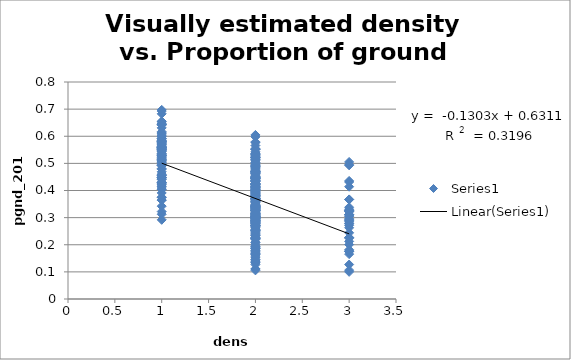
| Category | Series 0 |
|---|---|
| 2.0 | 0.276 |
| 2.0 | 0.466 |
| 1.0 | 0.522 |
| 1.0 | 0.528 |
| 2.0 | 0.464 |
| 2.0 | 0.472 |
| 2.0 | 0.423 |
| 2.0 | 0.474 |
| 2.0 | 0.461 |
| 1.0 | 0.43 |
| 1.0 | 0.542 |
| 2.0 | 0.434 |
| 1.0 | 0.492 |
| 1.0 | 0.446 |
| 1.0 | 0.59 |
| 1.0 | 0.46 |
| 1.0 | 0.555 |
| 1.0 | 0.585 |
| 2.0 | 0.466 |
| 1.0 | 0.457 |
| 2.0 | 0.401 |
| 2.0 | 0.42 |
| 2.0 | 0.426 |
| 2.0 | 0.323 |
| 2.0 | 0.555 |
| 1.0 | 0.517 |
| 1.0 | 0.559 |
| 1.0 | 0.592 |
| 2.0 | 0.399 |
| 2.0 | 0.421 |
| 1.0 | 0.481 |
| 2.0 | 0.426 |
| 1.0 | 0.644 |
| 2.0 | 0.371 |
| 2.0 | 0.407 |
| 1.0 | 0.693 |
| 1.0 | 0.697 |
| 1.0 | 0.574 |
| 2.0 | 0.491 |
| 2.0 | 0.434 |
| 2.0 | 0.299 |
| 2.0 | 0.521 |
| 2.0 | 0.411 |
| 3.0 | 0.505 |
| 1.0 | 0.469 |
| 1.0 | 0.405 |
| 1.0 | 0.548 |
| 1.0 | 0.605 |
| 2.0 | 0.46 |
| 1.0 | 0.43 |
| 1.0 | 0.567 |
| 1.0 | 0.55 |
| 2.0 | 0.444 |
| 2.0 | 0.443 |
| 2.0 | 0.535 |
| 2.0 | 0.492 |
| 2.0 | 0.503 |
| 2.0 | 0.498 |
| 2.0 | 0.438 |
| 1.0 | 0.655 |
| 3.0 | 0.338 |
| 2.0 | 0.434 |
| 2.0 | 0.525 |
| 2.0 | 0.51 |
| 1.0 | 0.553 |
| 2.0 | 0.514 |
| 2.0 | 0.451 |
| 2.0 | 0.409 |
| 2.0 | 0.409 |
| 2.0 | 0.421 |
| 1.0 | 0.455 |
| 2.0 | 0.422 |
| 1.0 | 0.501 |
| 1.0 | 0.376 |
| 1.0 | 0.454 |
| 2.0 | 0.416 |
| 2.0 | 0.395 |
| 2.0 | 0.443 |
| 2.0 | 0.39 |
| 1.0 | 0.524 |
| 2.0 | 0.367 |
| 2.0 | 0.381 |
| 2.0 | 0.448 |
| 2.0 | 0.417 |
| 1.0 | 0.558 |
| 1.0 | 0.653 |
| 2.0 | 0.482 |
| 1.0 | 0.492 |
| 2.0 | 0.515 |
| 2.0 | 0.422 |
| 2.0 | 0.45 |
| 2.0 | 0.536 |
| 2.0 | 0.579 |
| 1.0 | 0.571 |
| 2.0 | 0.47 |
| 3.0 | 0.495 |
| 2.0 | 0.454 |
| 2.0 | 0.427 |
| 2.0 | 0.495 |
| 2.0 | 0.414 |
| 2.0 | 0.34 |
| 2.0 | 0.521 |
| 2.0 | 0.552 |
| 2.0 | 0.52 |
| 2.0 | 0.49 |
| 1.0 | 0.645 |
| 2.0 | 0.409 |
| 2.0 | 0.449 |
| 1.0 | 0.562 |
| 2.0 | 0.487 |
| 1.0 | 0.515 |
| 1.0 | 0.581 |
| 1.0 | 0.559 |
| 3.0 | 0.493 |
| 3.0 | 0.277 |
| 2.0 | 0.42 |
| 2.0 | 0.437 |
| 2.0 | 0.529 |
| 2.0 | 0.534 |
| 2.0 | 0.577 |
| 2.0 | 0.598 |
| 2.0 | 0.483 |
| 2.0 | 0.366 |
| 2.0 | 0.427 |
| 2.0 | 0.513 |
| 2.0 | 0.534 |
| 1.0 | 0.617 |
| 1.0 | 0.559 |
| 2.0 | 0.531 |
| 1.0 | 0.551 |
| 2.0 | 0.463 |
| 3.0 | 0.414 |
| 2.0 | 0.489 |
| 2.0 | 0.384 |
| 3.0 | 0.367 |
| 3.0 | 0.367 |
| 2.0 | 0.338 |
| 1.0 | 0.415 |
| 2.0 | 0.535 |
| 2.0 | 0.504 |
| 2.0 | 0.432 |
| 2.0 | 0.452 |
| 2.0 | 0.519 |
| 2.0 | 0.47 |
| 2.0 | 0.35 |
| 1.0 | 0.425 |
| 1.0 | 0.585 |
| 1.0 | 0.508 |
| 2.0 | 0.406 |
| 2.0 | 0.371 |
| 2.0 | 0.411 |
| 2.0 | 0.363 |
| 2.0 | 0.469 |
| 2.0 | 0.388 |
| 2.0 | 0.52 |
| 2.0 | 0.444 |
| 2.0 | 0.413 |
| 2.0 | 0.442 |
| 3.0 | 0.435 |
| 2.0 | 0.535 |
| 3.0 | 0.327 |
| 1.0 | 0.598 |
| 2.0 | 0.379 |
| 3.0 | 0.244 |
| 1.0 | 0.645 |
| 3.0 | 0.326 |
| 1.0 | 0.569 |
| 1.0 | 0.545 |
| 2.0 | 0.538 |
| 3.0 | 0.325 |
| 1.0 | 0.613 |
| 1.0 | 0.53 |
| 1.0 | 0.51 |
| 1.0 | 0.571 |
| 2.0 | 0.448 |
| 2.0 | 0.424 |
| 2.0 | 0.284 |
| 3.0 | 0.431 |
| 2.0 | 0.396 |
| 2.0 | 0.485 |
| 1.0 | 0.576 |
| 2.0 | 0.202 |
| 2.0 | 0.334 |
| 3.0 | 0.201 |
| 2.0 | 0.451 |
| 2.0 | 0.288 |
| 2.0 | 0.282 |
| 2.0 | 0.416 |
| 2.0 | 0.411 |
| 1.0 | 0.631 |
| 2.0 | 0.34 |
| 2.0 | 0.414 |
| 2.0 | 0.438 |
| 2.0 | 0.398 |
| 1.0 | 0.44 |
| 2.0 | 0.467 |
| 2.0 | 0.242 |
| 2.0 | 0.395 |
| 2.0 | 0.444 |
| 3.0 | 0.306 |
| 2.0 | 0.45 |
| 1.0 | 0.495 |
| 1.0 | 0.529 |
| 1.0 | 0.551 |
| 1.0 | 0.404 |
| 1.0 | 0.431 |
| 1.0 | 0.643 |
| 1.0 | 0.58 |
| 1.0 | 0.553 |
| 1.0 | 0.449 |
| 1.0 | 0.479 |
| 1.0 | 0.645 |
| 1.0 | 0.683 |
| 1.0 | 0.562 |
| 1.0 | 0.535 |
| 2.0 | 0.497 |
| 2.0 | 0.552 |
| 2.0 | 0.605 |
| 2.0 | 0.448 |
| 1.0 | 0.559 |
| 1.0 | 0.537 |
| 1.0 | 0.611 |
| 1.0 | 0.601 |
| 1.0 | 0.515 |
| 1.0 | 0.509 |
| 2.0 | 0.551 |
| 2.0 | 0.566 |
| 1.0 | 0.591 |
| 2.0 | 0.543 |
| 1.0 | 0.581 |
| 1.0 | 0.576 |
| 2.0 | 0.257 |
| 2.0 | 0.178 |
| 2.0 | 0.234 |
| 1.0 | 0.447 |
| 1.0 | 0.555 |
| 2.0 | 0.386 |
| 2.0 | 0.225 |
| 2.0 | 0.181 |
| 2.0 | 0.326 |
| 2.0 | 0.337 |
| 2.0 | 0.295 |
| 2.0 | 0.321 |
| 1.0 | 0.374 |
| 1.0 | 0.447 |
| 2.0 | 0.21 |
| 2.0 | 0.298 |
| 2.0 | 0.306 |
| 2.0 | 0.225 |
| 2.0 | 0.268 |
| 2.0 | 0.29 |
| 2.0 | 0.327 |
| 2.0 | 0.32 |
| 2.0 | 0.31 |
| 2.0 | 0.338 |
| 1.0 | 0.503 |
| 1.0 | 0.424 |
| 2.0 | 0.361 |
| 2.0 | 0.286 |
| 3.0 | 0.278 |
| 2.0 | 0.383 |
| 2.0 | 0.437 |
| 2.0 | 0.394 |
| 2.0 | 0.304 |
| 2.0 | 0.378 |
| 2.0 | 0.222 |
| 2.0 | 0.262 |
| 2.0 | 0.282 |
| 2.0 | 0.251 |
| 2.0 | 0.371 |
| 2.0 | 0.426 |
| 2.0 | 0.305 |
| 2.0 | 0.405 |
| 2.0 | 0.312 |
| 1.0 | 0.493 |
| 2.0 | 0.35 |
| 2.0 | 0.284 |
| 2.0 | 0.302 |
| 2.0 | 0.287 |
| 3.0 | 0.212 |
| 1.0 | 0.531 |
| 1.0 | 0.447 |
| 2.0 | 0.272 |
| 2.0 | 0.297 |
| 1.0 | 0.365 |
| 2.0 | 0.275 |
| 2.0 | 0.4 |
| 2.0 | 0.366 |
| 2.0 | 0.278 |
| 2.0 | 0.347 |
| 2.0 | 0.305 |
| 2.0 | 0.301 |
| 2.0 | 0.382 |
| 3.0 | 0.29 |
| 3.0 | 0.296 |
| 2.0 | 0.329 |
| 2.0 | 0.398 |
| 2.0 | 0.308 |
| 2.0 | 0.3 |
| 2.0 | 0.523 |
| 2.0 | 0.303 |
| 3.0 | 0.322 |
| 2.0 | 0.313 |
| 2.0 | 0.271 |
| 2.0 | 0.316 |
| 2.0 | 0.488 |
| 2.0 | 0.522 |
| 2.0 | 0.297 |
| 1.0 | 0.546 |
| 2.0 | 0.304 |
| 2.0 | 0.267 |
| 2.0 | 0.326 |
| 2.0 | 0.341 |
| 2.0 | 0.33 |
| 1.0 | 0.533 |
| 1.0 | 0.527 |
| 1.0 | 0.458 |
| 1.0 | 0.364 |
| 2.0 | 0.338 |
| 2.0 | 0.327 |
| 2.0 | 0.315 |
| 2.0 | 0.237 |
| 2.0 | 0.289 |
| 2.0 | 0.286 |
| 2.0 | 0.35 |
| 2.0 | 0.377 |
| 2.0 | 0.357 |
| 1.0 | 0.641 |
| 1.0 | 0.413 |
| 2.0 | 0.225 |
| 2.0 | 0.254 |
| 2.0 | 0.339 |
| 2.0 | 0.405 |
| 2.0 | 0.472 |
| 2.0 | 0.389 |
| 2.0 | 0.3 |
| 2.0 | 0.371 |
| 2.0 | 0.347 |
| 2.0 | 0.326 |
| 2.0 | 0.292 |
| 2.0 | 0.297 |
| 2.0 | 0.391 |
| 2.0 | 0.335 |
| 2.0 | 0.347 |
| 2.0 | 0.339 |
| 2.0 | 0.279 |
| 1.0 | 0.421 |
| 2.0 | 0.327 |
| 2.0 | 0.344 |
| 2.0 | 0.308 |
| 2.0 | 0.277 |
| 2.0 | 0.278 |
| 2.0 | 0.318 |
| 2.0 | 0.328 |
| 2.0 | 0.399 |
| 2.0 | 0.343 |
| 2.0 | 0.404 |
| 2.0 | 0.374 |
| 2.0 | 0.398 |
| 2.0 | 0.476 |
| 2.0 | 0.269 |
| 2.0 | 0.464 |
| 2.0 | 0.303 |
| 2.0 | 0.223 |
| 2.0 | 0.314 |
| 2.0 | 0.334 |
| 2.0 | 0.257 |
| 2.0 | 0.291 |
| 2.0 | 0.36 |
| 2.0 | 0.341 |
| 2.0 | 0.371 |
| 2.0 | 0.298 |
| 2.0 | 0.334 |
| 2.0 | 0.344 |
| 2.0 | 0.196 |
| 2.0 | 0.14 |
| 3.0 | 0.177 |
| 2.0 | 0.301 |
| 3.0 | 0.182 |
| 1.0 | 0.292 |
| 2.0 | 0.359 |
| 3.0 | 0.312 |
| 3.0 | 0.322 |
| 2.0 | 0.381 |
| 2.0 | 0.346 |
| 2.0 | 0.284 |
| 3.0 | 0.311 |
| 3.0 | 0.284 |
| 2.0 | 0.192 |
| 2.0 | 0.392 |
| 2.0 | 0.358 |
| 2.0 | 0.163 |
| 2.0 | 0.311 |
| 2.0 | 0.139 |
| 2.0 | 0.133 |
| 2.0 | 0.293 |
| 2.0 | 0.234 |
| 2.0 | 0.281 |
| 2.0 | 0.34 |
| 2.0 | 0.106 |
| 3.0 | 0.224 |
| 3.0 | 0.294 |
| 1.0 | 0.442 |
| 2.0 | 0.186 |
| 2.0 | 0.313 |
| 2.0 | 0.244 |
| 2.0 | 0.288 |
| 2.0 | 0.271 |
| 3.0 | 0.127 |
| 3.0 | 0.331 |
| 2.0 | 0.185 |
| 2.0 | 0.33 |
| 2.0 | 0.44 |
| 2.0 | 0.177 |
| 2.0 | 0.254 |
| 2.0 | 0.135 |
| 2.0 | 0.145 |
| 1.0 | 0.342 |
| 2.0 | 0.262 |
| 3.0 | 0.288 |
| 2.0 | 0.312 |
| 2.0 | 0.27 |
| 2.0 | 0.189 |
| 2.0 | 0.162 |
| 2.0 | 0.208 |
| 2.0 | 0.292 |
| 2.0 | 0.284 |
| 1.0 | 0.312 |
| 2.0 | 0.305 |
| 2.0 | 0.219 |
| 2.0 | 0.253 |
| 3.0 | 0.227 |
| 2.0 | 0.166 |
| 3.0 | 0.175 |
| 2.0 | 0.223 |
| 2.0 | 0.27 |
| 2.0 | 0.168 |
| 3.0 | 0.165 |
| 3.0 | 0.106 |
| 2.0 | 0.361 |
| 2.0 | 0.152 |
| 2.0 | 0.249 |
| 3.0 | 0.271 |
| 3.0 | 0.305 |
| 3.0 | 0.311 |
| 3.0 | 0.176 |
| 3.0 | 0.226 |
| 2.0 | 0.404 |
| 1.0 | 0.322 |
| 2.0 | 0.11 |
| 2.0 | 0.356 |
| 2.0 | 0.136 |
| 2.0 | 0.111 |
| 2.0 | 0.343 |
| 2.0 | 0.155 |
| 2.0 | 0.193 |
| 3.0 | 0.263 |
| 2.0 | 0.47 |
| 2.0 | 0.444 |
| 2.0 | 0.262 |
| 2.0 | 0.315 |
| 2.0 | 0.17 |
| 3.0 | 0.1 |
| 1.0 | 0.391 |
| 2.0 | 0.228 |
| 2.0 | 0.309 |
| 2.0 | 0.314 |
| 2.0 | 0.174 |
| 2.0 | 0.127 |
| 2.0 | 0.29 |
| 2.0 | 0.165 |
| 2.0 | 0.187 |
| 2.0 | 0.145 |